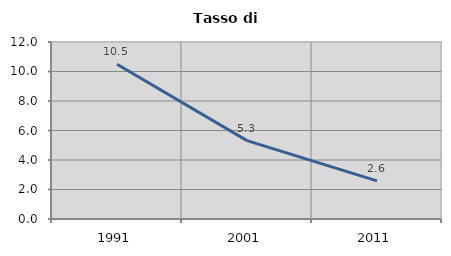
| Category | Tasso di disoccupazione   |
|---|---|
| 1991.0 | 10.493 |
| 2001.0 | 5.314 |
| 2011.0 | 2.587 |